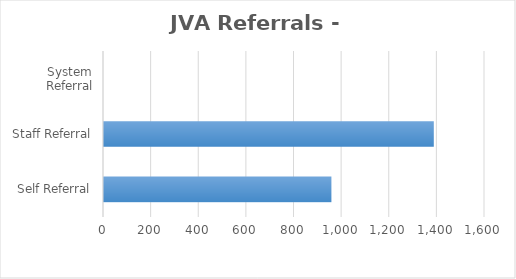
| Category | Series 0 |
|---|---|
| Self Referral | 955 |
| Staff Referral | 1385 |
| System Referral | 0 |